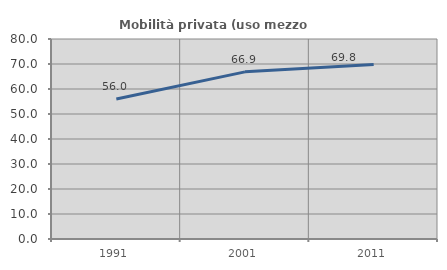
| Category | Mobilità privata (uso mezzo privato) |
|---|---|
| 1991.0 | 55.965 |
| 2001.0 | 66.852 |
| 2011.0 | 69.831 |